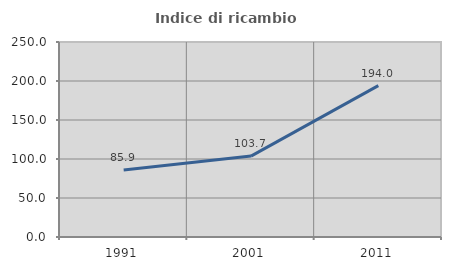
| Category | Indice di ricambio occupazionale  |
|---|---|
| 1991.0 | 85.915 |
| 2001.0 | 103.704 |
| 2011.0 | 194.03 |